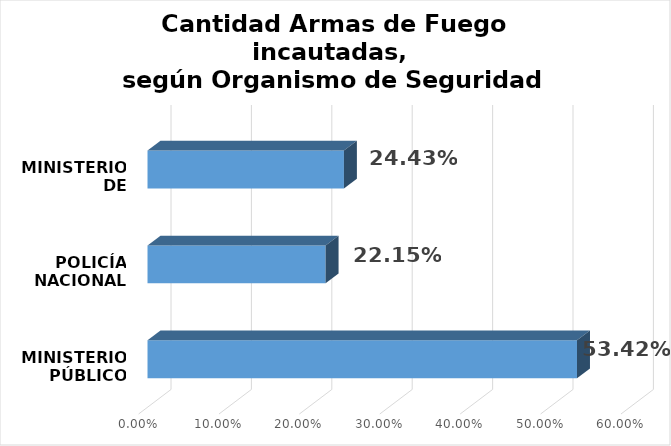
| Category | Series 0 |
|---|---|
| MINISTERIO PÚBLICO | 0.534 |
| POLICÍA NACIONAL | 0.221 |
| MINISTERIO DE DEFENSA | 0.244 |